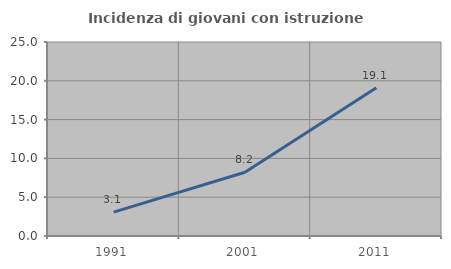
| Category | Incidenza di giovani con istruzione universitaria |
|---|---|
| 1991.0 | 3.07 |
| 2001.0 | 8.209 |
| 2011.0 | 19.111 |